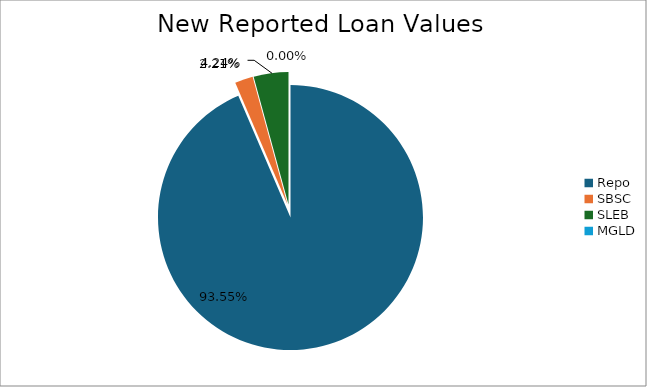
| Category | Series 0 |
|---|---|
| Repo | 10787261.672 |
| SBSC | 254712.451 |
| SLEB | 488546.421 |
| MGLD | 112.868 |